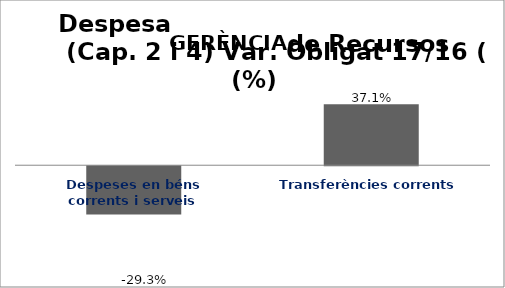
| Category | Series 0 |
|---|---|
| Despeses en béns corrents i serveis | -0.293 |
| Transferències corrents | 0.371 |